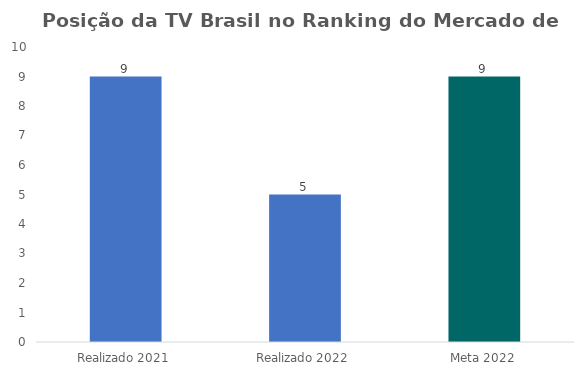
| Category | Series 0 |
|---|---|
| Realizado 2021 | 9 |
| Realizado 2022 | 5 |
| Meta 2022 | 9 |